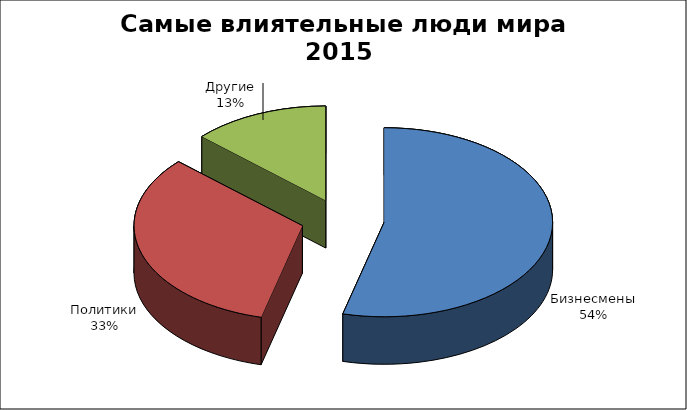
| Category | Series 0 |
|---|---|
| Бизнесмены | 41 |
| Политики | 25 |
| Другие | 10 |